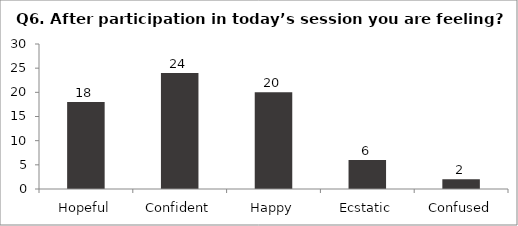
| Category | Q6. After participation in today’s session you are feeling? |
|---|---|
| Hopeful | 18 |
| Confident | 24 |
| Happy | 20 |
| Ecstatic | 6 |
| Confused | 2 |